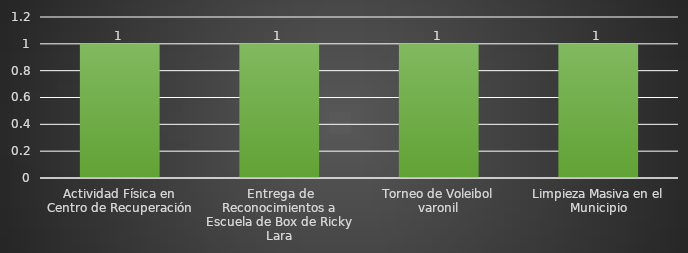
| Category | INDICADOR  |
|---|---|
| Actividad Física en Centro de Recuperación | 1 |
| Entrega de Reconocimientos a Escuela de Box de Ricky Lara | 1 |
| Torneo de Voleibol varonil | 1 |
| Limpieza Masiva en el Municipio | 1 |